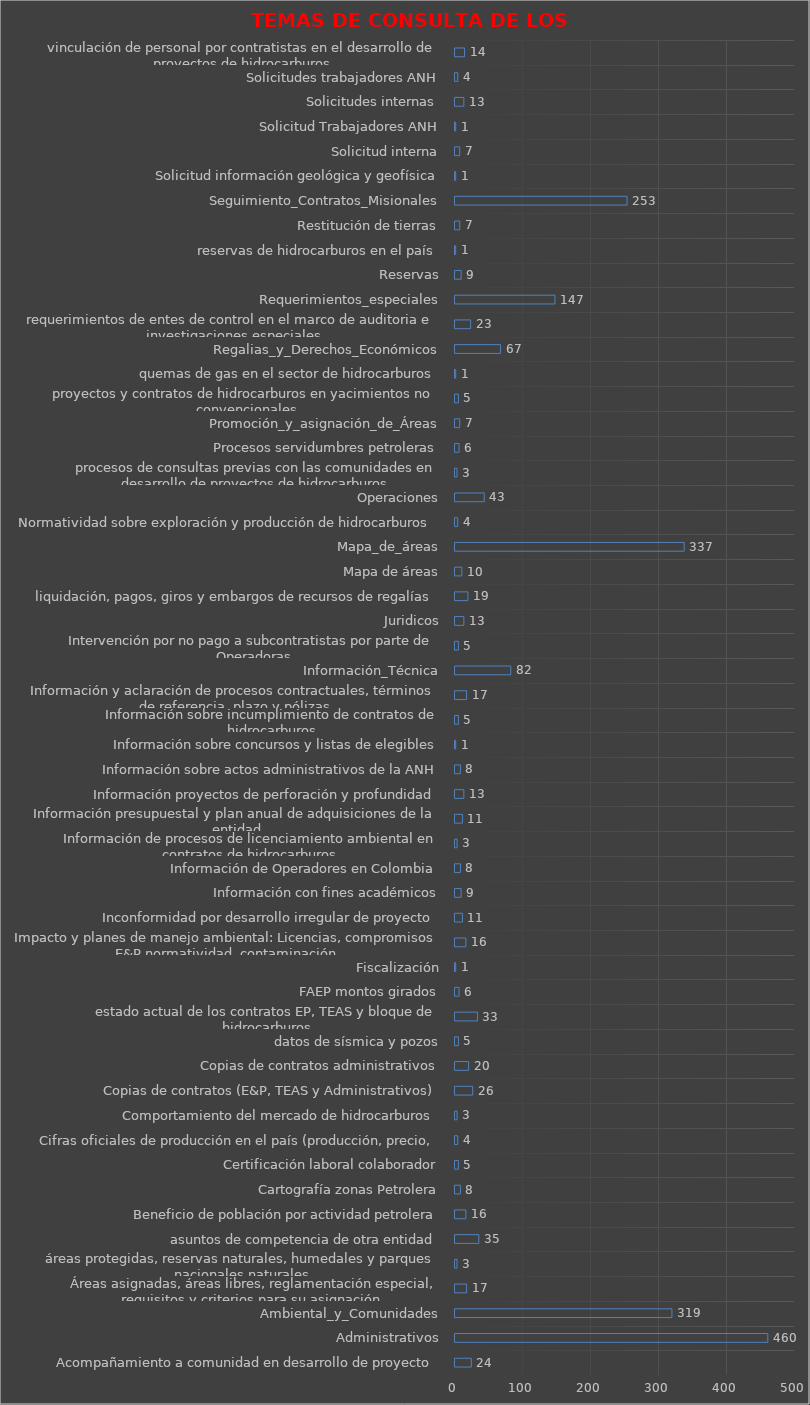
| Category | TEMAS DE CONSULTA DE 2020 |
|---|---|
| Acompañamiento a comunidad en desarrollo de proyecto | 24 |
| Administrativos | 460 |
| Ambiental_y_Comunidades | 319 |
| Áreas asignadas, áreas libres, reglamentación especial, requisitos y criterios para su asignación. | 17 |
| áreas protegidas, reservas naturales, humedales y parques nacionales naturales | 3 |
| asuntos de competencia de otra entidad | 35 |
| Beneficio de población por actividad petrolera | 16 |
| Cartografía zonas Petrolera | 8 |
| Certificación laboral colaborador | 5 |
| Cifras oficiales de producción en el país (producción, precio, | 4 |
| Comportamiento del mercado de hidrocarburos | 3 |
| Copias de contratos (E&P, TEAS y Administrativos) | 26 |
| Copias de contratos administrativos | 20 |
| datos de sísmica y pozos | 5 |
| estado actual de los contratos EP, TEAS y bloque de hidrocarburos | 33 |
| FAEP montos girados | 6 |
| Fiscalización | 1 |
| Impacto y planes de manejo ambiental: Licencias, compromisos E&P normatividad, contaminación | 16 |
| Inconformidad por desarrollo irregular de proyecto | 11 |
| Información con fines académicos | 9 |
| Información de Operadores en Colombia | 8 |
| Información de procesos de licenciamiento ambiental en contratos de hidrocarburos | 3 |
| Información presupuestal y plan anual de adquisiciones de la entidad | 11 |
| Información proyectos de perforación y profundidad | 13 |
| Información sobre actos administrativos de la ANH | 8 |
| Información sobre concursos y listas de elegibles | 1 |
| Información sobre incumplimiento de contratos de hidrocarburos | 5 |
| Información y aclaración de procesos contractuales, términos de referencia, plazo y pólizas | 17 |
| Información_Técnica | 82 |
| Intervención por no pago a subcontratistas por parte de Operadoras | 5 |
| Juridicos | 13 |
| liquidación, pagos, giros y embargos de recursos de regalías | 19 |
| Mapa de áreas | 10 |
| Mapa_de_áreas | 337 |
| Normatividad sobre exploración y producción de hidrocarburos | 4 |
| Operaciones | 43 |
| procesos de consultas previas con las comunidades en desarrollo de proyectos de hidrocarburos | 3 |
| Procesos servidumbres petroleras | 6 |
| Promoción_y_asignación_de_Áreas | 7 |
| proyectos y contratos de hidrocarburos en yacimientos no convencionales | 5 |
| quemas de gas en el sector de hidrocarburos | 1 |
| Regalias_y_Derechos_Económicos | 67 |
| requerimientos de entes de control en el marco de auditoria e investigaciones especiales | 23 |
| Requerimientos_especiales | 147 |
| Reservas | 9 |
| reservas de hidrocarburos en el país | 1 |
| Restitución de tierras | 7 |
| Seguimiento_Contratos_Misionales | 253 |
| Solicitud información geológica y geofísica | 1 |
| Solicitud interna | 7 |
| Solicitud Trabajadores ANH | 1 |
| Solicitudes internas  | 13 |
| Solicitudes trabajadores ANH | 4 |
| vinculación de personal por contratistas en el desarrollo de proyectos de hidrocarburos | 14 |